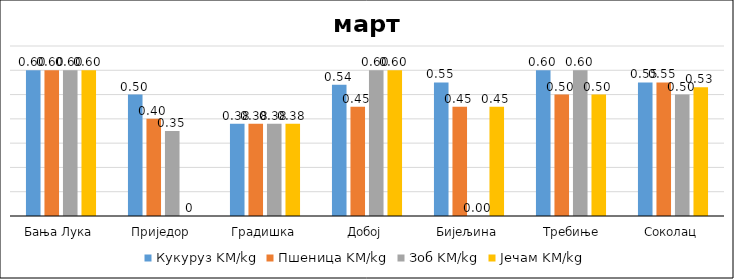
| Category | Кукуруз | Пшеница | Зоб | Јечам |
|---|---|---|---|---|
| Бања Лука | 0.6 | 0.6 | 0.6 | 0.6 |
| Приједор | 0.5 | 0.4 | 0.35 | 0 |
| Градишка | 0.38 | 0.38 | 0.38 | 0.38 |
| Добој | 0.54 | 0.45 | 0.6 | 0.6 |
| Бијељина | 0.55 | 0.45 | 0 | 0.45 |
|  Требиње | 0.6 | 0.5 | 0.6 | 0.5 |
| Соколац | 0.55 | 0.55 | 0.5 | 0.53 |